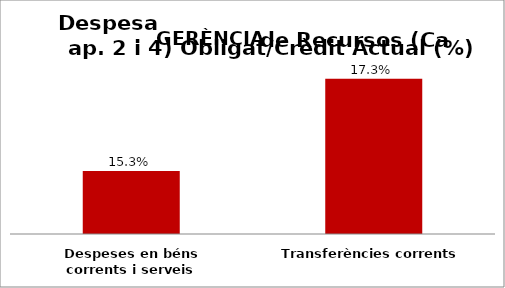
| Category | Series 0 |
|---|---|
| Despeses en béns corrents i serveis | 0.153 |
| Transferències corrents | 0.173 |